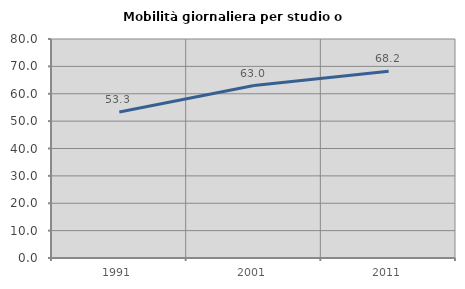
| Category | Mobilità giornaliera per studio o lavoro |
|---|---|
| 1991.0 | 53.308 |
| 2001.0 | 62.982 |
| 2011.0 | 68.239 |